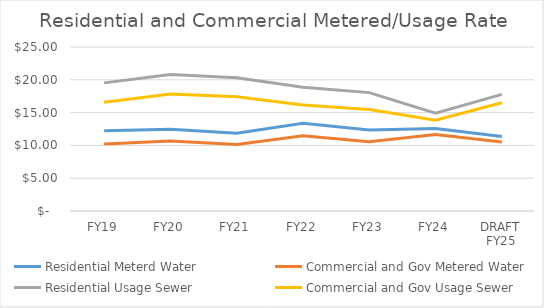
| Category | Residential Meterd Water | Commercial and Gov Metered Water | Residential Usage Sewer | Commercial and Gov Usage Sewer |
|---|---|---|---|---|
| FY19 | 12.24 | 10.23 | 19.53 | 16.57 |
| FY20 | 12.45 | 10.671 | 20.803 | 17.831 |
| FY21 | 11.848 | 10.156 | 20.317 | 17.415 |
| FY22 | 13.389 | 11.476 | 18.87 | 16.175 |
| FY23 | 12.335 | 10.572 | 18.045 | 15.467 |
| FY24 | 12.574 | 11.676 | 14.919 | 13.853 |
| DRAFT FY25 | 11.34 | 10.53 | 17.77 | 16.5 |